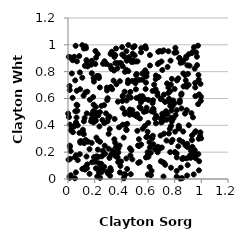
| Category | Series 0 |
|---|---|
| 0.046676937674423886 | 0.911 |
| 0.1731907339990109 | 0.43 |
| 0.23156018715488924 | 0.117 |
| 0.42760766730506783 | 0.799 |
| 0.5336893021140406 | 0.738 |
| 0.09268886672519401 | 0.27 |
| 0.6367927705438385 | 0.322 |
| 0.9290513467448243 | 0.939 |
| 0.5379660975195389 | 0.127 |
| 0.7785230968841657 | 0.429 |
| 0.4707104948257748 | 0.607 |
| 0.7468949703240096 | 0.835 |
| 0.8391897326390824 | 0.586 |
| 0.34968576601538326 | 0.447 |
| 0.6953053178982544 | 0.449 |
| 0.2968760122465636 | 0.43 |
| 0.5696426322543541 | 0.795 |
| 0.6722983463575628 | 0.199 |
| 0.41036892436965217 | 0.84 |
| 0.5864340884211007 | 0.505 |
| 0.4175408332572171 | 0.308 |
| 0.5846683655671804 | 0.718 |
| 0.8909354414835754 | 0.513 |
| 0.013335728364849 | 0.249 |
| 0.11955547361146536 | 0.972 |
| 0.7665870626792595 | 0.2 |
| 0.6250503684640436 | 0.505 |
| 0.1328308287717144 | 0.291 |
| 0.09125341376203373 | 0.281 |
| 0.519206114093471 | 0.483 |
| 0.5092706347199005 | 0.669 |
| 0.2057818210240638 | 0.954 |
| 0.917273317381685 | 0.159 |
| 0.08429098524658475 | 0.916 |
| 0.5367592920172873 | 0.536 |
| 0.37214312046848014 | 0.162 |
| 0.32955264627195086 | 0.936 |
| 0.4754985411567399 | 0.214 |
| 0.6524488144445785 | 0.223 |
| 0.08940384945948819 | 0.794 |
| 0.06554562086051482 | 0.658 |
| 0.7155857116474972 | 0.467 |
| 0.5565957550004644 | 0.74 |
| 0.07018524425496449 | 0.508 |
| 0.7394409686287119 | 0.442 |
| 0.8590399694918804 | 0.276 |
| 0.057574957408292556 | 0.993 |
| 0.1640557005931702 | 0.591 |
| 0.8646857087342421 | 0.787 |
| 0.597121755670744 | 0.352 |
| 0.22286788275097186 | 0.93 |
| 0.8962677892962819 | 0.238 |
| 0.05966879743334477 | 0.412 |
| 0.8829805018857326 | 0.698 |
| 0.4433115345549993 | 0.075 |
| 0.7727190102088954 | 0.084 |
| 0.5390898360487064 | 0.451 |
| 0.877691282450784 | 0.487 |
| 0.06703394839677779 | 0.877 |
| 0.6721994752635393 | 0.623 |
| 0.2846353952011683 | 0.489 |
| 0.3286666740754009 | 0.821 |
| 0.9331424568217861 | 0.24 |
| 0.25059040371349994 | 0.05 |
| 0.16177745395152135 | 0.038 |
| 0.14742301760385748 | 0.839 |
| 0.8595227222581635 | 0.87 |
| 0.3744627109753005 | 0.576 |
| 0.19228619816168752 | 0.554 |
| 0.2237660073145369 | 0.219 |
| 0.5092260927614612 | 0.877 |
| 0.7224204070046648 | 0.118 |
| 0.19194597458374296 | 0.752 |
| 0.2569839202288496 | 0.072 |
| 0.4314366114576344 | 0.403 |
| 0.0547269025426534 | 0.505 |
| 0.509920508866802 | 0.476 |
| 0.9805405721133529 | 0.741 |
| 0.8153659750011059 | 0.06 |
| 0.6747229036105801 | 0.24 |
| 0.4223224963584687 | 0.027 |
| 0.8628799058367227 | 0.879 |
| 0.8327770680637624 | 0.376 |
| 0.6208491824398406 | 0.195 |
| 0.5112553337236531 | 0.774 |
| 0.1950958757126044 | 0.163 |
| 0.3544520413392117 | 0.922 |
| 0.9212706771769078 | 0.159 |
| 0.3020972747949281 | 0.454 |
| 0.8375365185972018 | 0.571 |
| 0.052238632556893504 | 0.006 |
| 0.8130604562920429 | 0.943 |
| 0.9370957154208669 | 0.46 |
| 0.19401418803622206 | 0.726 |
| 0.9499446730407738 | 0.346 |
| 0.9395151472527965 | 0.951 |
| 0.036636022783196574 | 0.349 |
| 0.9255698461596198 | 0.491 |
| 0.7634444239329383 | 0.373 |
| 0.4866858603612687 | 0.482 |
| 0.38935800254068825 | 0.049 |
| 0.4557319380780795 | 0.618 |
| 0.24084133738431882 | 0.009 |
| 0.4056241756335786 | 0.983 |
| 0.7072956053577886 | 0.812 |
| 0.17869045569367317 | 0.881 |
| 0.2168766772427906 | 0.767 |
| 0.4097821111222963 | 0.619 |
| 0.4984210118251923 | 0.481 |
| 0.8934281752644695 | 0.026 |
| 0.7985944220098996 | 0.941 |
| 0.43978977307100736 | 0.585 |
| 0.23875659458211201 | 0.682 |
| 0.5146095974420601 | 0.783 |
| 0.752792451541724 | 0.952 |
| 0.20892436236240533 | 0.435 |
| 0.3156066523986101 | 0.024 |
| 0.8156582640601323 | 0.513 |
| 0.1773685117092146 | 0.27 |
| 0.3931472308274868 | 0.097 |
| 0.01286693904584747 | 0.663 |
| 0.6878301164890219 | 0.225 |
| 0.9302752011022033 | 0.325 |
| 0.597187901010962 | 0.2 |
| 0.32052714300663593 | 0.686 |
| 0.2168477848707807 | 0.758 |
| 0.38875025675613023 | 0.729 |
| 0.01736045135898978 | 0.906 |
| 0.8976954201139312 | 0.104 |
| 0.30467689092527306 | 0.226 |
| 0.9838768596884649 | 0.132 |
| 0.7998085724246662 | 0.671 |
| 0.4377117583783472 | 0.153 |
| 0.20186721276086267 | 0.493 |
| 0.8308493931554167 | 0.397 |
| 0.7084889299643606 | 0.428 |
| 0.6994989402984891 | 0.421 |
| 0.23003936401347205 | 0.768 |
| 0.5799627387163104 | 0.989 |
| 0.589466531291116 | 0.79 |
| 0.9785981418582956 | 0.776 |
| 0.6147685263011925 | 0.846 |
| 0.3828943100506701 | 0.385 |
| 0.23957370365303335 | 0.499 |
| 0.5819730832315049 | 0.671 |
| 0.0471722198335955 | 0.391 |
| 0.9747172168335393 | 0.994 |
| 0.4851650287341322 | 0.934 |
| 0.2090150252280079 | 0.08 |
| 0.29189423171228585 | 0.054 |
| 0.7727391313128991 | 0.395 |
| 0.14242598938925052 | 0.08 |
| 0.942835989518905 | 0.034 |
| 0.5403230809583446 | 0.616 |
| 0.4681067112876465 | 0.176 |
| 0.8515045136892441 | 0.526 |
| 0.6463657964301295 | 0.703 |
| 0.23893202538417474 | 0.079 |
| 0.49045672037080884 | 0.874 |
| 0.3706067786411054 | 0.825 |
| 0.011603717096283836 | 0.019 |
| 0.13044044634643015 | 0.646 |
| 0.7741159163835692 | 0.275 |
| 0.7351591692281364 | 0.505 |
| 0.8995198972721726 | 0.784 |
| 0.2196414838713818 | 0.019 |
| 0.059234877027061233 | 0.177 |
| 0.5572932057896541 | 0.785 |
| 0.9817779440189164 | 0.064 |
| 0.27404348837066406 | 0.878 |
| 0.6528094300983222 | 0.449 |
| 0.11687470963969998 | 0.621 |
| 0.28181051340614854 | 0.859 |
| 0.7568397486729 | 0.339 |
| 0.520176294162281 | 0.359 |
| 0.5795129214809566 | 0.81 |
| 0.021428901937924915 | 0.364 |
| 0.38695176546716287 | 0.249 |
| 0.49946462558968147 | 0.99 |
| 0.6014732816024693 | 0.418 |
| 0.2712519921636725 | 0.092 |
| 0.13853399145398415 | 0.886 |
| 0.8556199636965999 | 0.006 |
| 0.8344403950042217 | 0.9 |
| 0.7901646861157391 | 0.451 |
| 0.752416801457777 | 0.641 |
| 0.16144195128851072 | 0.222 |
| 0.028684990321949867 | 0.787 |
| 0.9681500463335102 | 0.849 |
| 0.5454567520497118 | 0.527 |
| 0.18899549003778846 | 0.505 |
| 0.32327126791351357 | 0.064 |
| 0.5901798876041708 | 0.166 |
| 0.12360925044257637 | 0.085 |
| 0.8941179046650222 | 0.262 |
| 0.8454051927353424 | 0.085 |
| 0.3110599835457872 | 0.157 |
| 0.46474136235282115 | 0.229 |
| 0.7666994723166691 | 0.545 |
| 0.47757962831922895 | 0.872 |
| 0.5964522816426117 | 0.316 |
| 0.3230929309330791 | 0.181 |
| 0.4404803323994665 | 0.881 |
| 0.5375475191852845 | 0.596 |
| 0.33392427875408065 | 0.212 |
| 0.24889701971087067 | 0.114 |
| 0.0010635826426977852 | 0.488 |
| 0.30048827100565284 | 0.04 |
| 0.6770147875417601 | 0.948 |
| 0.3603756276541707 | 0.238 |
| 0.8147388297407242 | 0.018 |
| 0.5250355212838486 | 0.25 |
| 0.584997234121754 | 0.973 |
| 0.7282032309949886 | 0.574 |
| 0.46795644756283933 | 0.649 |
| 0.39663160583756957 | 0.865 |
| 0.004017448057230958 | 0.144 |
| 0.034287747404613475 | 0.605 |
| 0.6318326608256549 | 0.304 |
| 0.6793232202820944 | 0.76 |
| 0.6219023781600583 | 0.029 |
| 0.40665322084471983 | 0.927 |
| 0.4301725525817708 | 0.497 |
| 0.005926100241357826 | 0.91 |
| 0.18058778471610612 | 0.125 |
| 0.4849873381048481 | 0.884 |
| 0.17822526094861293 | 0.789 |
| 0.23142157496354893 | 0.05 |
| 0.1388701952417476 | 0.168 |
| 0.7532573207696533 | 0.682 |
| 0.7839074247458218 | 0.292 |
| 0.6117314428070794 | 0.09 |
| 0.05228154762342658 | 0.162 |
| 0.33103349226327805 | 0.67 |
| 0.27751942156855225 | 0.187 |
| 0.4826434473045821 | 0.731 |
| 0.7292939424367355 | 0.106 |
| 0.7718510145786598 | 0.703 |
| 0.7009824638826786 | 0.876 |
| 0.6997395988194663 | 0.595 |
| 0.5458758141814352 | 0.581 |
| 0.42218435398407644 | 0.912 |
| 0.5326873376344007 | 0.246 |
| 0.20104690119422503 | 0.129 |
| 0.22739539564156597 | 0.165 |
| 0.11404873586985102 | 0.344 |
| 0.6966209705767614 | 0.132 |
| 0.2536996646733097 | 0.169 |
| 0.029349135643793933 | 0.385 |
| 0.4191301906429188 | 0.005 |
| 0.6965018484824774 | 0.595 |
| 0.261613111439334 | 0.21 |
| 0.09031626180511935 | 0.669 |
| 0.8617144096504336 | 0.156 |
| 0.6623028654885308 | 0.47 |
| 0.8047026871852438 | 0.196 |
| 0.5795040314999311 | 0.765 |
| 0.9509197089460705 | 0.215 |
| 0.9116271095676838 | 0.845 |
| 0.7653796191227267 | 0.654 |
| 0.7982351386778459 | 0.563 |
| 0.6567747601375253 | 0.669 |
| 0.7763192005087426 | 0.51 |
| 0.360275278710591 | 0.972 |
| 0.5267040356092753 | 0.12 |
| 0.12472536284638086 | 0.454 |
| 0.3178613780326637 | 0.844 |
| 0.034895528340997774 | 0.885 |
| 0.9541997551984307 | 0.683 |
| 0.26219415900358123 | 0.859 |
| 0.9759566808740957 | 0.558 |
| 0.06406409400634035 | 0.458 |
| 0.702666696735508 | 0.455 |
| 0.06018690966733417 | 0.423 |
| 0.8775115392148062 | 0.775 |
| 0.2753304862945135 | 0.248 |
| 0.17473535762787337 | 0.852 |
| 0.3279488693203214 | 0.948 |
| 0.6143881808407408 | 0.235 |
| 0.3113338534782187 | 0.466 |
| 0.22482096264188062 | 0.288 |
| 0.8650165731351144 | 0.154 |
| 0.5116528102095552 | 0.47 |
| 0.8442961135586228 | 0.866 |
| 0.42586921903577735 | 0.486 |
| 0.14996468605418806 | 0.278 |
| 0.6348286272017003 | 0.656 |
| 0.4999931282567323 | 0.921 |
| 0.05405943608713265 | 0.735 |
| 0.9773985862411543 | 0.186 |
| 0.4707546040542924 | 0.036 |
| 0.5054530087620377 | 0.714 |
| 0.7429478002552824 | 0.712 |
| 0.23562032283682216 | 0.392 |
| 0.547349668052422 | 0.573 |
| 0.6427055654996492 | 0.499 |
| 0.6596077660288989 | 0.415 |
| 0.5489249252545415 | 0.257 |
| 0.5498278083829402 | 0.975 |
| 0.10751676692487913 | 0.075 |
| 0.762517824391527 | 0.572 |
| 0.5099286013655342 | 0.736 |
| 0.35000501313897375 | 0.925 |
| 0.8803495025709801 | 0.251 |
| 0.4296417057332826 | 0.032 |
| 0.17719850614638696 | 0.482 |
| 0.2920733755424991 | 0.66 |
| 0.7462450643580057 | 0.484 |
| 0.602907782331563 | 0.589 |
| 0.9929195489582779 | 0.347 |
| 0.06477872015754783 | 0.553 |
| 0.5893531135583372 | 0.532 |
| 0.4521831901090685 | 0.804 |
| 0.43695466735920246 | 0.369 |
| 0.34800778798052007 | 0.91 |
| 0.5190108359200212 | 0.465 |
| 0.21089338614616993 | 0.904 |
| 0.3535897971083259 | 0.27 |
| 0.9499482972654503 | 0.823 |
| 0.8900513913134721 | 0.153 |
| 0.20531044773496626 | 0.144 |
| 0.06988730031232145 | 0.549 |
| 0.827024461425214 | 0.244 |
| 0.5151721267317756 | 0.604 |
| 0.14492622633513338 | 0.651 |
| 0.2578332420932501 | 0.44 |
| 0.05904667961419439 | 0.05 |
| 0.610637764297836 | 0.274 |
| 0.5751061505551872 | 0.596 |
| 0.6580167238168255 | 0.745 |
| 0.4524635927805768 | 0.998 |
| 0.990369149846694 | 0.322 |
| 0.8425466244286772 | 0.003 |
| 0.4495421552162856 | 0.715 |
| 0.015900933295398826 | 0.15 |
| 0.957961263671676 | 0.355 |
| 0.3973389604751989 | 0.131 |
| 0.6378950347058552 | 0.587 |
| 0.9667757710414732 | 0.911 |
| 0.1213800841724869 | 0.267 |
| 0.0885522296969212 | 0.185 |
| 0.17695083299720848 | 0.448 |
| 0.37722946494891824 | 0.226 |
| 0.46154528586146715 | 0.479 |
| 0.7163863908999234 | 0.018 |
| 0.7204091490595579 | 0.338 |
| 0.3628780821798959 | 0.706 |
| 0.5848214861149837 | 0.16 |
| 0.945118709762319 | 0.192 |
| 0.8016530323521839 | 0.2 |
| 0.7071751713168705 | 0.487 |
| 0.20501177725771602 | 0.463 |
| 0.9834342100472789 | 0.631 |
| 0.351793660552625 | 0.195 |
| 0.7692624707880285 | 0.882 |
| 0.7197517543221705 | 0.629 |
| 0.8160482211995947 | 0.161 |
| 0.7386796991757151 | 0.287 |
| 0.01131254985869165 | 0.693 |
| 0.4640189177873881 | 0.518 |
| 0.8864602373824809 | 0.901 |
| 0.6688771296491367 | 0.643 |
| 0.7099371441382194 | 0.126 |
| 0.9577844659695542 | 0.154 |
| 0.4824444248860417 | 0.513 |
| 0.560051431718217 | 0.375 |
| 0.0733326902855516 | 0.141 |
| 0.0729282425018432 | 0.4 |
| 0.914639213226625 | 0.175 |
| 0.7582573063526906 | 0.598 |
| 0.817294212596679 | 0.735 |
| 0.5215242595917049 | 0.877 |
| 0.9057558737165539 | 0.401 |
| 0.31306145721162937 | 0.372 |
| 0.4880793085549877 | 0.98 |
| 0.20477014177567027 | 0.857 |
| 0.2084721523131198 | 0.537 |
| 0.7726117846574002 | 0.454 |
| 0.22727546776773266 | 0.474 |
| 0.013736217169282347 | 0.239 |
| 0.6807876227893973 | 0.864 |
| 0.43844322872972913 | 0.814 |
| 0.1263784011054417 | 0.844 |
| 0.2130831507313603 | 0.309 |
| 0.9969850894983238 | 0.613 |
| 0.9051153431127194 | 0.702 |
| 0.8866396800112862 | 0.912 |
| 0.6738144842029629 | 0.857 |
| 0.14237165835493618 | 0.876 |
| 0.8054398134099673 | 0.977 |
| 0.8268740951494604 | 0.75 |
| 0.3553849862873231 | 0.865 |
| 0.6885416956836965 | 0.954 |
| 0.5887692642433846 | 0.765 |
| 0.4680082834914421 | 0.492 |
| 0.291620661692459 | 0.681 |
| 0.4504296442553802 | 0.736 |
| 0.4235039693484443 | 0.036 |
| 0.014502209180590671 | 0.405 |
| 0.8068924064484292 | 0.476 |
| 0.28896192931179143 | 0.858 |
| 0.3760376444659641 | 0.864 |
| 0.8037669939467939 | 0.352 |
| 0.8491277289171141 | 0.627 |
| 0.4074433069660559 | 0.581 |
| 0.5476679919790673 | 0.945 |
| 0.9223575799900378 | 0.211 |
| 0.6339496376838221 | 0.566 |
| 0.7895772712345045 | 0.585 |
| 0.0073682798715560835 | 0.462 |
| 0.11177156094417802 | 0.367 |
| 0.6941883951354908 | 0.324 |
| 0.3178691684323005 | 0.081 |
| 0.29427532823703834 | 0.588 |
| 0.8665931970179298 | 0.69 |
| 0.9957845530235843 | 0.582 |
| 0.2321842783138936 | 0.753 |
| 0.9448269075835343 | 0.982 |
| 0.6591246140997019 | 0.771 |
| 0.4440453885580857 | 0.411 |
| 0.4249046339863435 | 0.651 |
| 0.021047927732604332 | 0.028 |
| 0.1407439789725133 | 0.489 |
| 0.5592948711447782 | 0.617 |
| 0.09979321074192071 | 0.282 |
| 0.12725986349199214 | 0.07 |
| 0.6031046184695127 | 0.165 |
| 0.239890030508761 | 0.278 |
| 0.4580795722123372 | 0.908 |
| 0.43952468403163913 | 0.364 |
| 0.1320184762354557 | 0.989 |
| 0.37739381307627096 | 0.198 |
| 0.8641691870170831 | 0.354 |
| 0.21238189883054734 | 0.493 |
| 0.7787356329675972 | 0.746 |
| 0.34539305985665936 | 0.808 |
| 0.8572487527551992 | 0.149 |
| 0.8355351632370608 | 0.571 |
| 0.11854171949387114 | 0.334 |
| 0.9983595637995429 | 0.303 |
| 0.10712872624642594 | 0.997 |
| 0.3450268428644252 | 0.184 |
| 0.9553515733923481 | 0.618 |
| 0.9802293740157771 | 0.3 |
| 0.14389767309145657 | 0.109 |
| 0.8300500753888632 | 0.382 |
| 0.9937197946796977 | 0.709 |
| 0.11918515435954471 | 0.43 |
| 0.8367460009961701 | 0.29 |
| 0.37639336459731787 | 0.126 |
| 0.4821943390059885 | 0.147 |
| 0.18837992829220385 | 0.611 |
| 0.01322214938965575 | 0.009 |
| 0.08575674152579905 | 0.344 |
| 0.7051792200300068 | 0.95 |
| 0.21435061862010035 | 0.169 |
| 0.8517125389336334 | 0.637 |
| 0.4093336191357683 | 0.527 |
| 0.5877415547859629 | 0.312 |
| 0.7799395880866352 | 0.452 |
| 0.8832035980113807 | 0.736 |
| 0.6383708210354998 | 0.524 |
| 0.7834557778317598 | 0.542 |
| 0.25113746496731176 | 0.545 |
| 0.13484702916570515 | 0.975 |
| 0.569363160010475 | 0.5 |
| 0.9613205594875824 | 0.943 |
| 0.41192651871370467 | 0.616 |
| 0.8909954591692096 | 0.688 |
| 0.27216475657484696 | 0.416 |
| 0.30483965440226085 | 0.336 |
| 0.32573122349129563 | 0.822 |
| 0.4378301841881923 | 0.953 |
| 0.8948172784130509 | 0.848 |
| 0.19206636683643993 | 0.421 |
| 0.3192078632978032 | 0.932 |
| 0.8149757212156591 | 0.19 |
| 0.8918219632637219 | 0.701 |
| 0.531831426468567 | 0.297 |
| 0.10711741238548667 | 0.755 |
| 0.020121882544743327 | 0.208 |
| 0.5767958426044177 | 0.395 |
| 0.9561467307828785 | 0.175 |
| 0.2707869686305772 | 0.551 |
| 0.953980418301124 | 0.716 |
| 0.9294904942453207 | 0.29 |
| 0.8359218522264941 | 0.903 |
| 0.7178407115800389 | 0.959 |
| 0.641645185249537 | 0.519 |
| 0.5984196530813781 | 0.033 |
| 0.6402602953217132 | 0.259 |
| 0.7035035428348062 | 0.235 |
| 0.6142129476079128 | 0.924 |
| 0.29754501940942396 | 0.602 |
| 0.6269310440109518 | 0.061 |
| 0.3599466974670619 | 0.168 |
| 0.34183952123713585 | 0.733 |
| 0.3475471836387128 | 0.296 |
| 0.9065237314413043 | 0.931 |
| 0.41069421555246544 | 0.405 |